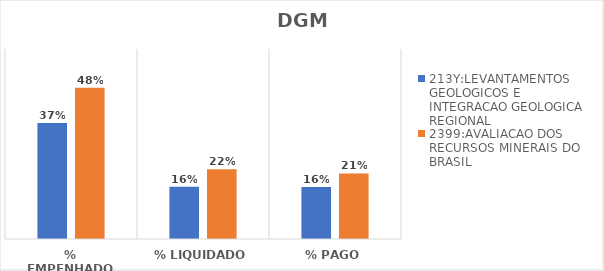
| Category | 213Y:LEVANTAMENTOS GEOLOGICOS E INTEGRACAO GEOLOGICA REGIONAL | 2399:AVALIACAO DOS RECURSOS MINERAIS DO BRASIL |
|---|---|---|
| % EMPENHADO | 0.366 | 0.477 |
| % LIQUIDADO | 0.165 | 0.221 |
| % PAGO | 0.164 | 0.207 |